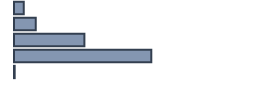
| Category | Percentatge |
|---|---|
| 0 | 4.088 |
| 1 | 9.092 |
| 2 | 29.331 |
| 3 | 57.206 |
| 4 | 0.283 |